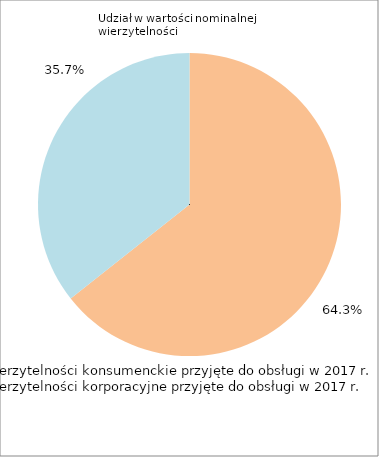
| Category | Series 0 |
|---|---|
| Wierzytelności konsumenckie przyjęte do obsługi w 2017 r. | 0.643 |
| Wierzytelności korporacyjne przyjęte do obsługi w 2017 r. | 0.357 |